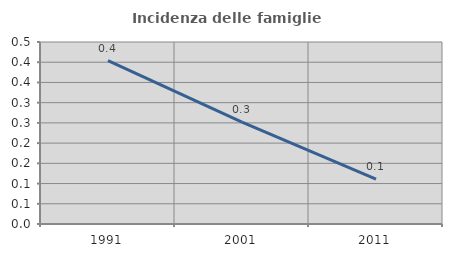
| Category | Incidenza delle famiglie numerose |
|---|---|
| 1991.0 | 0.404 |
| 2001.0 | 0.252 |
| 2011.0 | 0.111 |